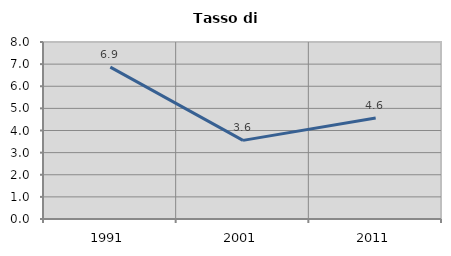
| Category | Tasso di disoccupazione   |
|---|---|
| 1991.0 | 6.863 |
| 2001.0 | 3.553 |
| 2011.0 | 4.564 |